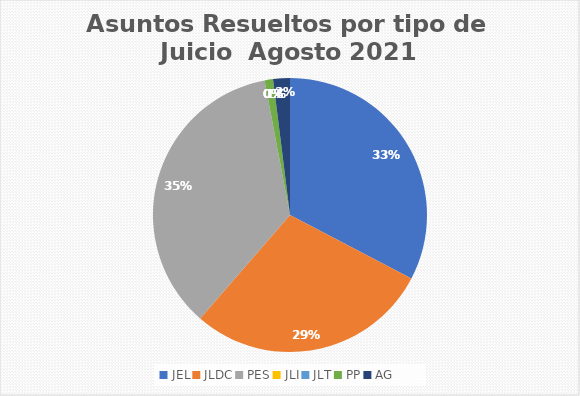
| Category | Asuntos Resueltos por tipo de Juicio  Agosto |
|---|---|
| JEL | 33 |
| JLDC | 29 |
| PES | 36 |
| JLI | 0 |
| JLT | 0 |
| PP | 1 |
| AG | 2 |